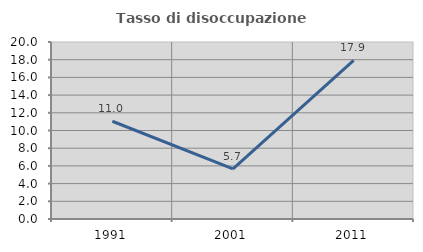
| Category | Tasso di disoccupazione giovanile  |
|---|---|
| 1991.0 | 11.047 |
| 2001.0 | 5.674 |
| 2011.0 | 17.931 |